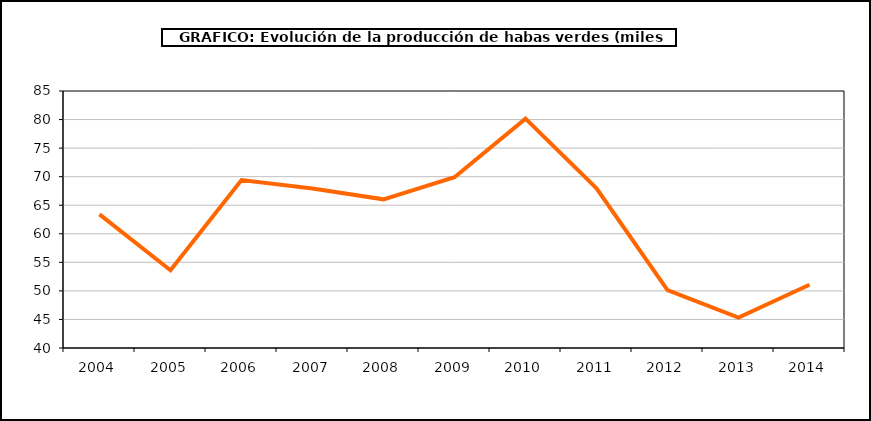
| Category | producción |
|---|---|
| 2004.0 | 63.395 |
| 2005.0 | 53.619 |
| 2006.0 | 69.402 |
| 2007.0 | 67.944 |
| 2008.0 | 66.032 |
| 2009.0 | 69.903 |
| 2010.0 | 80.156 |
| 2011.0 | 67.971 |
| 2012.0 | 50.149 |
| 2013.0 | 45.318 |
| 2014.0 | 51.081 |